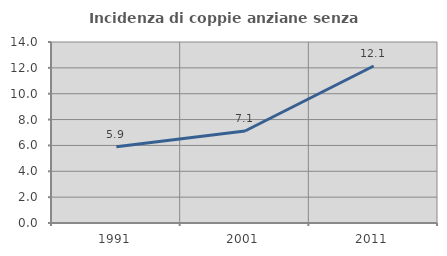
| Category | Incidenza di coppie anziane senza figli  |
|---|---|
| 1991.0 | 5.897 |
| 2001.0 | 7.117 |
| 2011.0 | 12.144 |